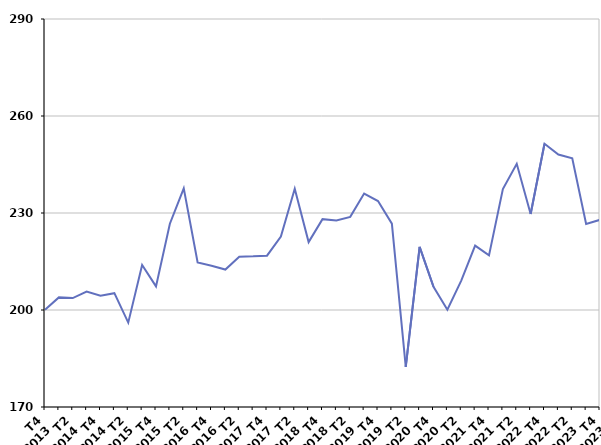
| Category | Cessation d'inscription pour défaut d'actualisation |
|---|---|
| T4
2013 | 200.1 |
| T1
2014 | 203.9 |
| T2
2014 | 203.7 |
| T3
2014 | 205.7 |
| T4
2014 | 204.4 |
| T1
2015 | 205.2 |
| T2
2015 | 196.1 |
| T3
2015 | 213.9 |
| T4
2015 | 207.3 |
| T1
2016 | 226.7 |
| T2
2016 | 237.6 |
| T3
2016 | 214.7 |
| T4
2016 | 213.7 |
| T1
2017 | 212.5 |
| T2
2017 | 216.5 |
| T3
2017 | 216.6 |
| T4
2017 | 216.8 |
| T1
2018 | 222.7 |
| T2
2018 | 237.5 |
| T3
2018 | 221 |
| T4
2018 | 228.1 |
| T1
2019 | 227.7 |
| T2
2019 | 228.8 |
| T3
2019 | 236 |
| T4
2019 | 233.7 |
| T1
2020 | 226.7 |
| T2
2020 | 182.4 |
| T3
2020 | 219.5 |
| T4
2020 | 207.2 |
| T1
2021 | 200.1 |
| T2
2021 | 209.1 |
| T3
2021 | 219.9 |
| T4
2021 | 216.9 |
| T1
2022 | 237.4 |
| T2
2022 | 245.2 |
| T3
2022 | 229.7 |
| T4
2022 | 251.4 |
| T1
2023 | 248.1 |
| T2
2023 | 246.9 |
| T3
2023 | 226.6 |
| T4
2023 | 227.9 |